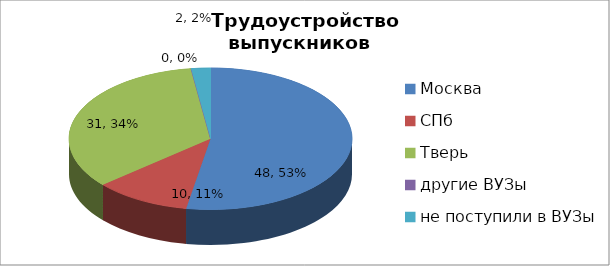
| Category | Series 0 |
|---|---|
| Москва | 48 |
| СПб | 10 |
| Тверь | 31 |
| другие ВУЗы | 0 |
| не поступили в ВУЗы | 2 |